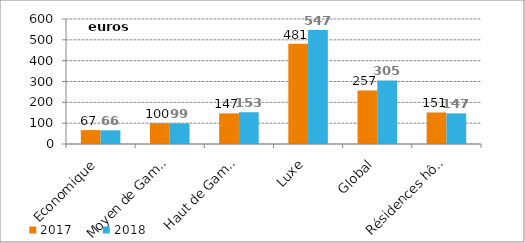
| Category | 2017 | 2018 |
|---|---|---|
| Economique | 66.601 | 65.586 |
| Moyen de Gamme | 100.372 | 99.35 |
| Haut de Gamme | 146.965 | 152.504 |
| Luxe | 481.367 | 546.796 |
| Global | 256.85 | 304.848 |
| Résidences hôtelières | 151.4 | 147.064 |